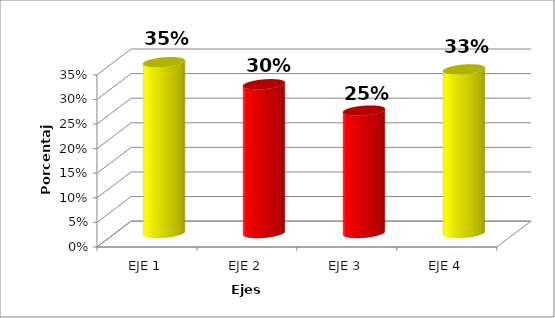
| Category | Series 0 |
|---|---|
| EJE 1 | 0.347 |
| EJE 2 | 0.302 |
| EJE 3 | 0.249 |
| EJE 4 | 0.333 |